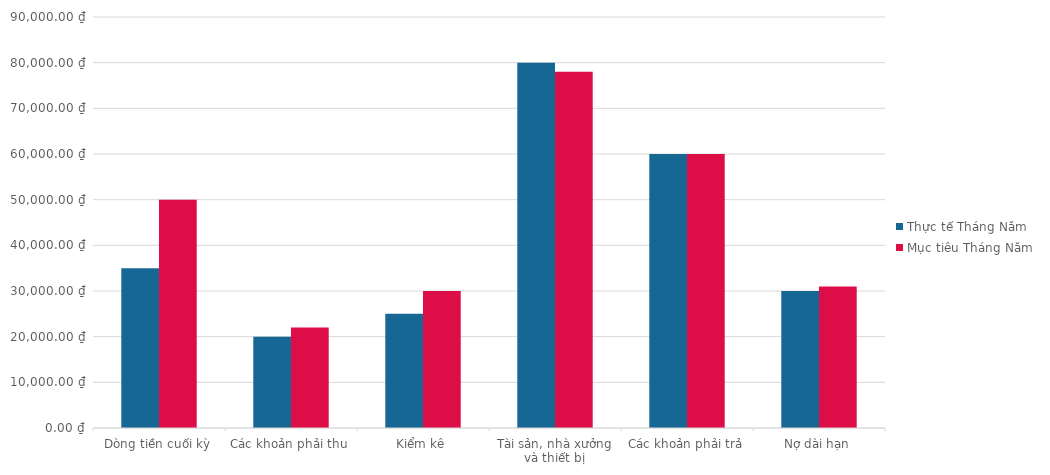
| Category | Thực tế Tháng Năm | Mục tiêu Tháng Năm |
|---|---|---|
| Dòng tiền cuối kỳ | 35000 | 50000 |
| Các khoản phải thu | 20000 | 22000 |
| Kiểm kê | 25000 | 30000 |
| Tài sản, nhà xưởng và thiết bị | 80000 | 78000 |
| Các khoản phải trả | 60000 | 60000 |
| Nợ dài hạn | 30000 | 31000 |